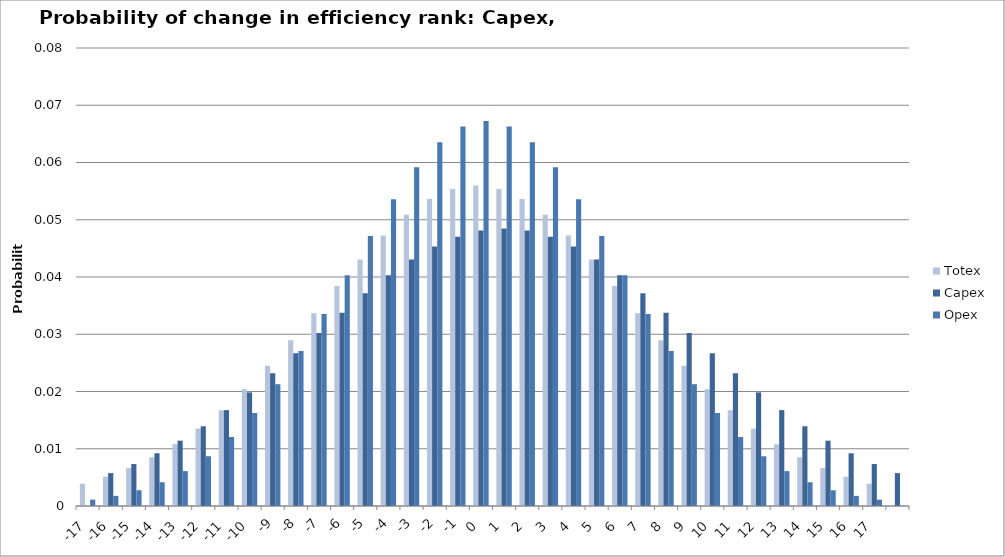
| Category | Totex | Capex | Opex |
|---|---|---|---|
| -17.0 | 0.004 | 0 | 0.001 |
| -16.0 | 0.005 | 0.006 | 0.002 |
| -15.0 | 0.007 | 0.007 | 0.003 |
| -14.0 | 0.009 | 0.009 | 0.004 |
| -13.0 | 0.011 | 0.011 | 0.006 |
| -12.0 | 0.014 | 0.014 | 0.009 |
| -11.0 | 0.017 | 0.017 | 0.012 |
| -10.0 | 0.02 | 0.02 | 0.016 |
| -9.0 | 0.025 | 0.023 | 0.021 |
| -8.0 | 0.029 | 0.027 | 0.027 |
| -7.0 | 0.034 | 0.03 | 0.034 |
| -6.0 | 0.038 | 0.034 | 0.04 |
| -5.0 | 0.043 | 0.037 | 0.047 |
| -4.0 | 0.047 | 0.04 | 0.054 |
| -3.0 | 0.051 | 0.043 | 0.059 |
| -2.0 | 0.054 | 0.045 | 0.064 |
| -1.0 | 0.055 | 0.047 | 0.066 |
| 0.0 | 0.056 | 0.048 | 0.067 |
| 1.0 | 0.055 | 0.048 | 0.066 |
| 2.0 | 0.054 | 0.048 | 0.064 |
| 3.0 | 0.051 | 0.047 | 0.059 |
| 4.0 | 0.047 | 0.045 | 0.054 |
| 5.0 | 0.043 | 0.043 | 0.047 |
| 6.0 | 0.038 | 0.04 | 0.04 |
| 7.0 | 0.034 | 0.037 | 0.034 |
| 8.0 | 0.029 | 0.034 | 0.027 |
| 9.0 | 0.025 | 0.03 | 0.021 |
| 10.0 | 0.02 | 0.027 | 0.016 |
| 11.0 | 0.017 | 0.023 | 0.012 |
| 12.0 | 0.014 | 0.02 | 0.009 |
| 13.0 | 0.011 | 0.017 | 0.006 |
| 14.0 | 0.009 | 0.014 | 0.004 |
| 15.0 | 0.007 | 0.011 | 0.003 |
| 16.0 | 0.005 | 0.009 | 0.002 |
| 17.0 | 0.004 | 0.007 | 0.001 |